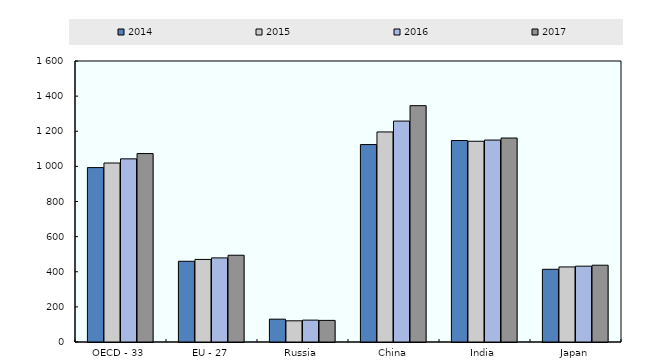
| Category | 2014 | 2015 | 2016 | 2017 |
|---|---|---|---|---|
| OECD - 33 | 992.992 | 1019.138 | 1042.866 | 1072.949 |
| EU - 27 | 459.647 | 470.124 | 478.995 | 494.112 |
| Russia | 130.027 | 120.644 | 124.62 | 123.096 |
| China | 1124.19 | 1196.06 | 1257.93 | 1345.69 |
| India | 1147.19 | 1143.039 | 1149.835 | 1161.333 |
| Japan | 413.97 | 427.486 | 431.799 | 437.235 |